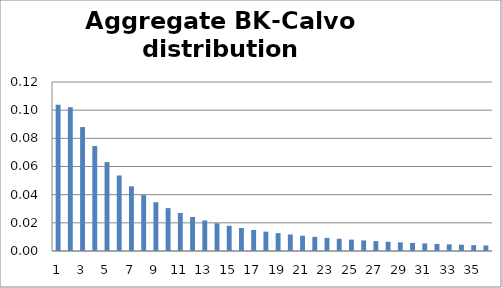
| Category | Series 0 |
|---|---|
| 0 | 0.104 |
| 1 | 0.102 |
| 2 | 0.088 |
| 3 | 0.075 |
| 4 | 0.063 |
| 5 | 0.054 |
| 6 | 0.046 |
| 7 | 0.04 |
| 8 | 0.035 |
| 9 | 0.03 |
| 10 | 0.027 |
| 11 | 0.024 |
| 12 | 0.022 |
| 13 | 0.02 |
| 14 | 0.018 |
| 15 | 0.016 |
| 16 | 0.015 |
| 17 | 0.014 |
| 18 | 0.013 |
| 19 | 0.012 |
| 20 | 0.011 |
| 21 | 0.01 |
| 22 | 0.009 |
| 23 | 0.009 |
| 24 | 0.008 |
| 25 | 0.008 |
| 26 | 0.007 |
| 27 | 0.007 |
| 28 | 0.006 |
| 29 | 0.006 |
| 30 | 0.005 |
| 31 | 0.005 |
| 32 | 0.005 |
| 33 | 0.004 |
| 34 | 0.004 |
| 35 | 0.004 |